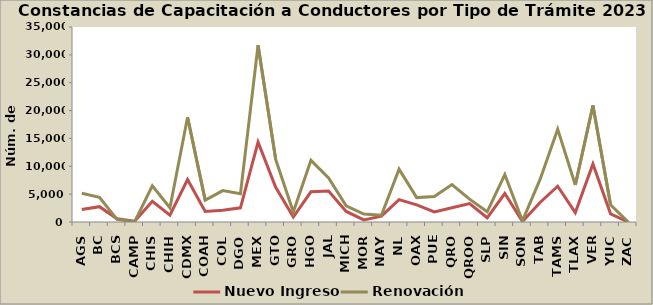
| Category | Nuevo Ingreso | Renovación |
|---|---|---|
| AGS | 2245 | 5162 |
| BC | 2751 | 4439 |
| BCS | 564 | 457 |
| CAMP | 132 | 54 |
| CHIS | 3719 | 6500 |
| CHIH | 1227 | 2570 |
| CDMX | 7624 | 18793 |
| COAH | 1897 | 3924 |
| COL | 2094 | 5636 |
| DGO | 2543 | 5056 |
| MEX | 14328 | 31741 |
| GTO | 6222 | 11237 |
| GRO | 894 | 1778 |
| HGO | 5419 | 11064 |
| JAL | 5544 | 7896 |
| MICH | 1901 | 2893 |
| MOR | 373 | 1420 |
| NAY | 1047 | 1225 |
| NL | 4024 | 9487 |
| OAX | 3074 | 4378 |
| PUE | 1822 | 4591 |
| QRO | 2567 | 6712 |
| QROO | 3299 | 4106 |
| SLP | 755 | 1829 |
| SIN | 5116 | 8516 |
| SON | 90 | 210 |
| TAB | 3502 | 7639 |
| TAMS | 6427 | 16669 |
| TLAX | 1681 | 6637 |
| VER | 10430 | 20918 |
| YUC | 1460 | 3102 |
| ZAC | 0 | 0 |